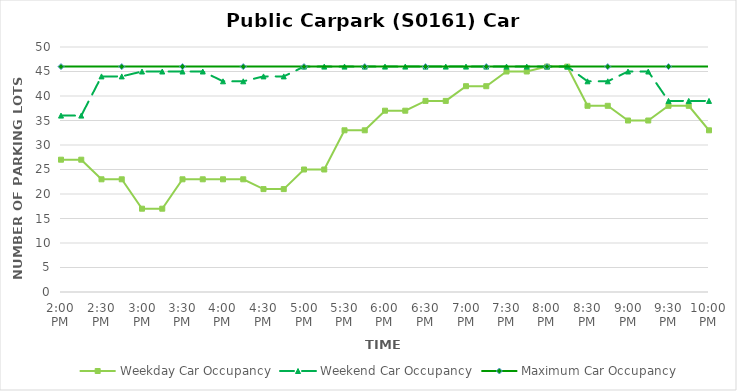
| Category | Weekday Car Occupancy | Weekend Car Occupancy | Maximum Car Occupancy |
|---|---|---|---|
| 0.5833333333333334 | 27 | 36 | 46 |
| 0.59375 | 27 | 36 | 46 |
| 0.604166666666667 | 23 | 44 | 46 |
| 0.614583333333333 | 23 | 44 | 46 |
| 0.625 | 17 | 45 | 46 |
| 0.635416666666666 | 17 | 45 | 46 |
| 0.645833333333333 | 23 | 45 | 46 |
| 0.65625 | 23 | 45 | 46 |
| 0.666666666666666 | 23 | 43 | 46 |
| 0.677083333333333 | 23 | 43 | 46 |
| 0.6875 | 21 | 44 | 46 |
| 0.697916666666666 | 21 | 44 | 46 |
| 0.708333333333333 | 25 | 46 | 46 |
| 0.718749999999999 | 25 | 46 | 46 |
| 0.729166666666666 | 33 | 46 | 46 |
| 0.739583333333333 | 33 | 46 | 46 |
| 0.75 | 37 | 46 | 46 |
| 0.7604166666666666 | 37 | 46 | 46 |
| 0.7708333333333334 | 39 | 46 | 46 |
| 0.78125 | 39 | 46 | 46 |
| 0.7916666666666666 | 42 | 46 | 46 |
| 0.8020833333333334 | 42 | 46 | 46 |
| 0.8125 | 45 | 46 | 46 |
| 0.8229166666666666 | 45 | 46 | 46 |
| 0.8333333333333334 | 46 | 46 | 46 |
| 0.84375 | 46 | 46 | 46 |
| 0.8541666666666666 | 38 | 43 | 46 |
| 0.8645833333333334 | 38 | 43 | 46 |
| 0.875 | 35 | 45 | 46 |
| 0.8854166666666666 | 35 | 45 | 46 |
| 0.8958333333333334 | 38 | 39 | 46 |
| 0.90625 | 38 | 39 | 46 |
| 0.9166666666666666 | 33 | 39 | 46 |